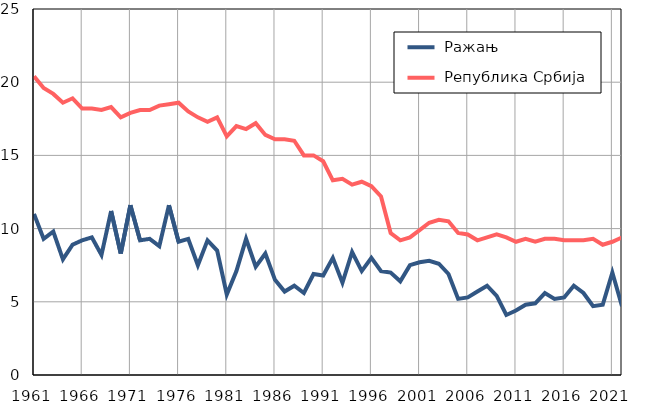
| Category |  Ражањ |  Република Србија |
|---|---|---|
| 1961.0 | 11 | 20.4 |
| 1962.0 | 9.3 | 19.6 |
| 1963.0 | 9.8 | 19.2 |
| 1964.0 | 7.9 | 18.6 |
| 1965.0 | 8.9 | 18.9 |
| 1966.0 | 9.2 | 18.2 |
| 1967.0 | 9.4 | 18.2 |
| 1968.0 | 8.2 | 18.1 |
| 1969.0 | 11.2 | 18.3 |
| 1970.0 | 8.3 | 17.6 |
| 1971.0 | 11.6 | 17.9 |
| 1972.0 | 9.2 | 18.1 |
| 1973.0 | 9.3 | 18.1 |
| 1974.0 | 8.8 | 18.4 |
| 1975.0 | 11.6 | 18.5 |
| 1976.0 | 9.1 | 18.6 |
| 1977.0 | 9.3 | 18 |
| 1978.0 | 7.5 | 17.6 |
| 1979.0 | 9.2 | 17.3 |
| 1980.0 | 8.5 | 17.6 |
| 1981.0 | 5.5 | 16.3 |
| 1982.0 | 7.1 | 17 |
| 1983.0 | 9.3 | 16.8 |
| 1984.0 | 7.4 | 17.2 |
| 1985.0 | 8.3 | 16.4 |
| 1986.0 | 6.5 | 16.1 |
| 1987.0 | 5.7 | 16.1 |
| 1988.0 | 6.1 | 16 |
| 1989.0 | 5.6 | 15 |
| 1990.0 | 6.9 | 15 |
| 1991.0 | 6.8 | 14.6 |
| 1992.0 | 8 | 13.3 |
| 1993.0 | 6.3 | 13.4 |
| 1994.0 | 8.4 | 13 |
| 1995.0 | 7.1 | 13.2 |
| 1996.0 | 8 | 12.9 |
| 1997.0 | 7.1 | 12.2 |
| 1998.0 | 7 | 9.7 |
| 1999.0 | 6.4 | 9.2 |
| 2000.0 | 7.5 | 9.4 |
| 2001.0 | 7.7 | 9.9 |
| 2002.0 | 7.8 | 10.4 |
| 2003.0 | 7.6 | 10.6 |
| 2004.0 | 6.9 | 10.5 |
| 2005.0 | 5.2 | 9.7 |
| 2006.0 | 5.3 | 9.6 |
| 2007.0 | 5.7 | 9.2 |
| 2008.0 | 6.1 | 9.4 |
| 2009.0 | 5.4 | 9.6 |
| 2010.0 | 4.1 | 9.4 |
| 2011.0 | 4.4 | 9.1 |
| 2012.0 | 4.8 | 9.3 |
| 2013.0 | 4.9 | 9.1 |
| 2014.0 | 5.6 | 9.3 |
| 2015.0 | 5.2 | 9.3 |
| 2016.0 | 5.3 | 9.2 |
| 2017.0 | 6.1 | 9.2 |
| 2018.0 | 5.6 | 9.2 |
| 2019.0 | 4.7 | 9.3 |
| 2020.0 | 4.8 | 8.9 |
| 2021.0 | 7 | 9.1 |
| 2022.0 | 4.7 | 9.4 |